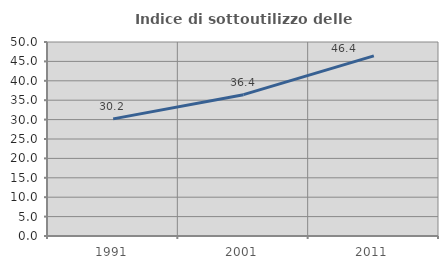
| Category | Indice di sottoutilizzo delle abitazioni  |
|---|---|
| 1991.0 | 30.189 |
| 2001.0 | 36.421 |
| 2011.0 | 46.412 |